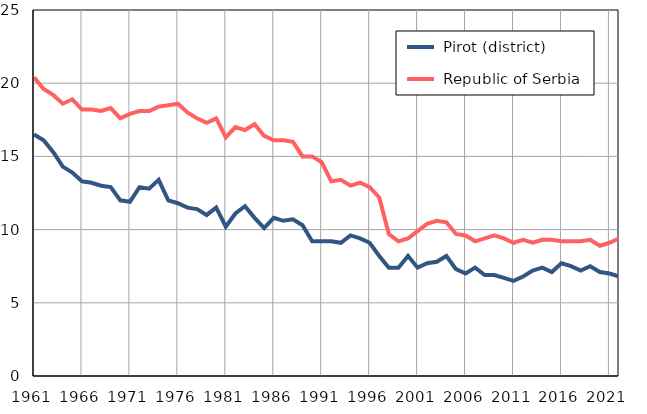
| Category |  Pirot (district) |  Republic of Serbia |
|---|---|---|
| 1961.0 | 16.5 | 20.4 |
| 1962.0 | 16.1 | 19.6 |
| 1963.0 | 15.3 | 19.2 |
| 1964.0 | 14.3 | 18.6 |
| 1965.0 | 13.9 | 18.9 |
| 1966.0 | 13.3 | 18.2 |
| 1967.0 | 13.2 | 18.2 |
| 1968.0 | 13 | 18.1 |
| 1969.0 | 12.9 | 18.3 |
| 1970.0 | 12 | 17.6 |
| 1971.0 | 11.9 | 17.9 |
| 1972.0 | 12.9 | 18.1 |
| 1973.0 | 12.8 | 18.1 |
| 1974.0 | 13.4 | 18.4 |
| 1975.0 | 12 | 18.5 |
| 1976.0 | 11.8 | 18.6 |
| 1977.0 | 11.5 | 18 |
| 1978.0 | 11.4 | 17.6 |
| 1979.0 | 11 | 17.3 |
| 1980.0 | 11.5 | 17.6 |
| 1981.0 | 10.2 | 16.3 |
| 1982.0 | 11.1 | 17 |
| 1983.0 | 11.6 | 16.8 |
| 1984.0 | 10.8 | 17.2 |
| 1985.0 | 10.1 | 16.4 |
| 1986.0 | 10.8 | 16.1 |
| 1987.0 | 10.6 | 16.1 |
| 1988.0 | 10.7 | 16 |
| 1989.0 | 10.3 | 15 |
| 1990.0 | 9.2 | 15 |
| 1991.0 | 9.2 | 14.6 |
| 1992.0 | 9.2 | 13.3 |
| 1993.0 | 9.1 | 13.4 |
| 1994.0 | 9.6 | 13 |
| 1995.0 | 9.4 | 13.2 |
| 1996.0 | 9.1 | 12.9 |
| 1997.0 | 8.2 | 12.2 |
| 1998.0 | 7.4 | 9.7 |
| 1999.0 | 7.4 | 9.2 |
| 2000.0 | 8.2 | 9.4 |
| 2001.0 | 7.4 | 9.9 |
| 2002.0 | 7.7 | 10.4 |
| 2003.0 | 7.8 | 10.6 |
| 2004.0 | 8.2 | 10.5 |
| 2005.0 | 7.3 | 9.7 |
| 2006.0 | 7 | 9.6 |
| 2007.0 | 7.4 | 9.2 |
| 2008.0 | 6.9 | 9.4 |
| 2009.0 | 6.9 | 9.6 |
| 2010.0 | 6.7 | 9.4 |
| 2011.0 | 6.5 | 9.1 |
| 2012.0 | 6.8 | 9.3 |
| 2013.0 | 7.2 | 9.1 |
| 2014.0 | 7.4 | 9.3 |
| 2015.0 | 7.1 | 9.3 |
| 2016.0 | 7.7 | 9.2 |
| 2017.0 | 7.5 | 9.2 |
| 2018.0 | 7.2 | 9.2 |
| 2019.0 | 7.5 | 9.3 |
| 2020.0 | 7.1 | 8.9 |
| 2021.0 | 7 | 9.1 |
| 2022.0 | 6.8 | 9.4 |